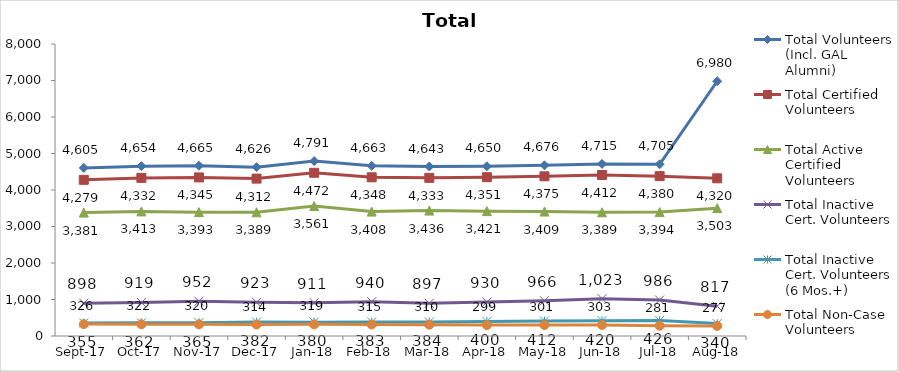
| Category | Total Volunteers (Incl. GAL Alumni) | Total Certified Volunteers | Total Active Certified Volunteers | Total Inactive Cert. Volunteers | Total Inactive Cert. Volunteers (6 Mos.+) | Total Non-Case Volunteers |
|---|---|---|---|---|---|---|
| 2017-09-01 | 4605 | 4279 | 3381 | 898 | 355 | 326 |
| 2017-10-01 | 4654 | 4332 | 3413 | 919 | 362 | 322 |
| 2017-11-01 | 4665 | 4345 | 3393 | 952 | 365 | 320 |
| 2017-12-01 | 4626 | 4312 | 3389 | 923 | 382 | 314 |
| 2018-01-01 | 4791 | 4472 | 3561 | 911 | 380 | 319 |
| 2018-02-01 | 4663 | 4348 | 3408 | 940 | 383 | 315 |
| 2018-03-01 | 4643 | 4333 | 3436 | 897 | 384 | 310 |
| 2018-04-01 | 4650 | 4351 | 3421 | 930 | 400 | 299 |
| 2018-05-01 | 4676 | 4375 | 3409 | 966 | 412 | 301 |
| 2018-06-01 | 4715 | 4412 | 3389 | 1023 | 420 | 303 |
| 2018-07-01 | 4705 | 4380 | 3394 | 986 | 426 | 281 |
| 2018-08-01 | 6980 | 4320 | 3503 | 817 | 340 | 277 |